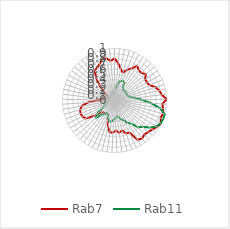
| Category | Rab7 | Rab11 |
|---|---|---|
| 0.0 | 0.809 | 0.159 |
| 0.10913 | 0.722 | 0.205 |
| 0.21825 | 0.623 | 0.335 |
| 0.32738 | 0.558 | 0.388 |
| 0.43651 | 0.635 | 0.41 |
| 0.54563 | 0.693 | 0.401 |
| 0.65476 | 0.794 | 0.301 |
| 0.76389 | 0.746 | 0.252 |
| 0.87302 | 0.739 | 0.265 |
| 0.98214 | 0.786 | 0.276 |
| 1.09127 | 0.717 | 0.249 |
| 1.2004 | 0.715 | 0.271 |
| 1.30952 | 0.738 | 0.262 |
| 1.41865 | 0.828 | 0.266 |
| 1.52778 | 0.882 | 0.327 |
| 1.6369 | 0.918 | 0.397 |
| 1.74603 | 1 | 0.531 |
| 1.85516 | 0.924 | 0.706 |
| 1.96429 | 0.947 | 0.893 |
| 2.07341 | 0.961 | 1 |
| 2.18254 | 0.949 | 0.999 |
| 2.29167 | 0.995 | 0.99 |
| 2.40079 | 0.959 | 0.947 |
| 2.50992 | 0.918 | 0.856 |
| 2.61905 | 0.889 | 0.742 |
| 2.72817 | 0.869 | 0.689 |
| 2.8373 | 0.903 | 0.552 |
| 2.94643 | 0.876 | 0.499 |
| 3.05556 | 0.68 | 0.42 |
| 3.16468 | 0.669 | 0.382 |
| 3.27381 | 0.593 | 0.326 |
| 3.38294 | 0.63 | 0.309 |
| 3.49206 | 0.582 | 0.35 |
| 3.60119 | 0.618 | 0.37 |
| 3.71032 | 0.624 | 0.406 |
| 3.81944 | 0.523 | 0.413 |
| 3.92857 | 0.391 | 0.359 |
| 4.0377 | 0.287 | 0.305 |
| 4.14683 | 0.285 | 0.278 |
| 4.25595 | 0.309 | 0.327 |
| 4.36508 | 0.311 | 0.359 |
| 4.47421 | 0.332 | 0.48 |
| 4.58333 | 0.486 | 0.416 |
| 4.69246 | 0.654 | 0.26 |
| 4.80159 | 0.69 | 0.205 |
| 4.91071 | 0.7 | 0.156 |
| 5.01984 | 0.682 | 0.173 |
| 5.12897 | 0.641 | 0.146 |
| 5.2381 | 0.512 | 0.17 |
| 5.34722 | 0.31 | 0.123 |
| 5.45635 | 0.172 | 0.091 |
| 5.56548 | 0.133 | 0.003 |
| 5.6746 | 0 | 0.01 |
| 5.78373 | 0.023 | 0.006 |
| 5.89286 | 0.141 | 0 |
| 6.00198 | 0.21 | 0.033 |
| 6.11111 | 0.278 | 0.054 |
| 6.22024 | 0.415 | 0.044 |
| 6.32937 | 0.565 | 0.08 |
| 6.43849 | 0.692 | 0.075 |
| 6.54762 | 0.715 | 0.112 |
| 6.65675 | 0.758 | 0.139 |
| 6.76587 | 0.827 | 0.122 |
| 6.875 | 0.829 | 0.165 |
| 6.98413 | 0.764 | 0.157 |